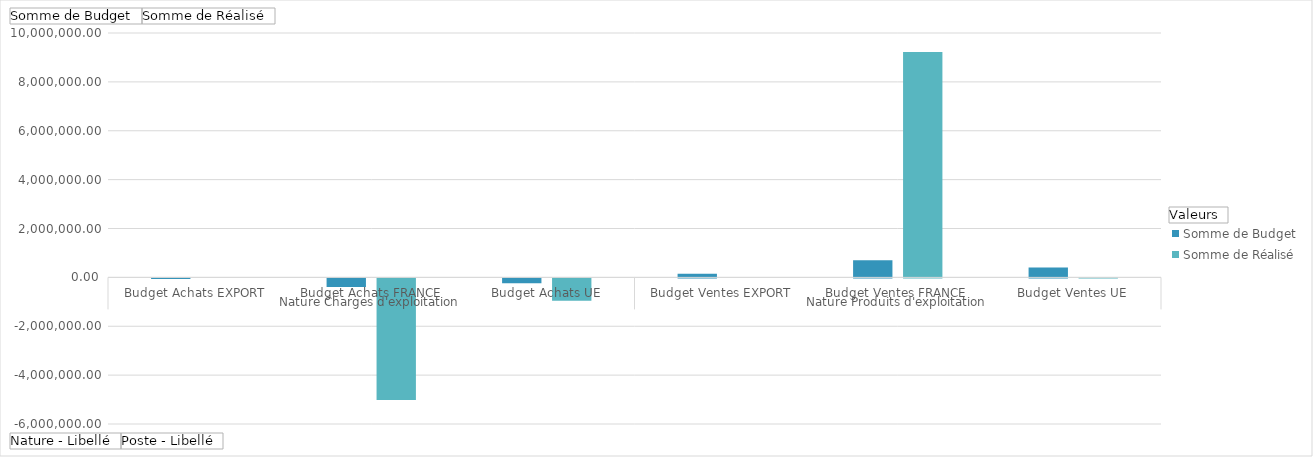
| Category | Somme de Budget | Somme de Réalisé |
|---|---|---|
| 0 | -25000 | 0 |
| 1 | -350000 | -4981098.09 |
| 2 | -200000 | -915992.2 |
| 3 | 150000 | 0 |
| 4 | 700000 | 9223510.14 |
| 5 | 400000 | 3.15 |